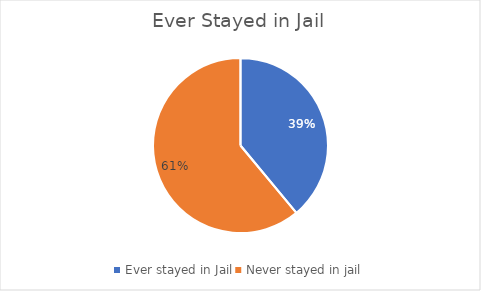
| Category | Series 0 |
|---|---|
| Ever stayed in Jail | 0.39 |
| Never stayed in jail | 0.61 |